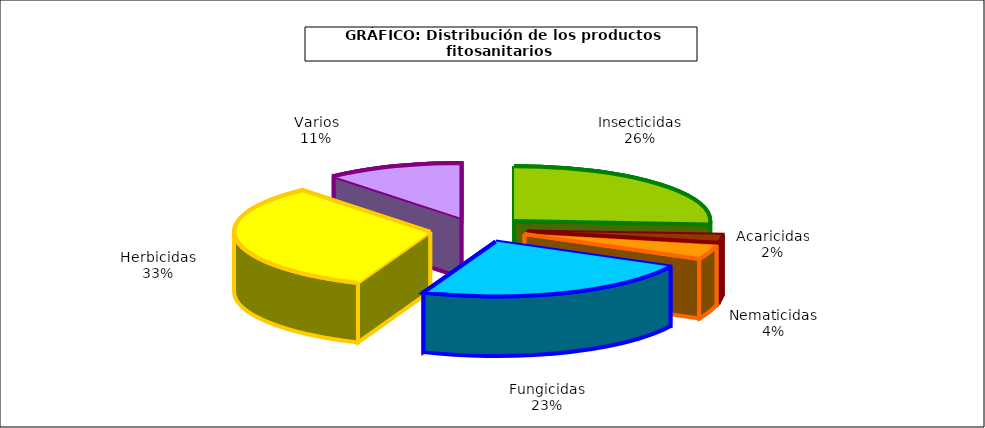
| Category | Insecticidas |
|---|---|
| Insecticidas | 316.736 |
| Acaricidas | 28.478 |
| Nematicidas | 51.233 |
| Fungicidas | 286.563 |
| Herbicidas | 398.945 |
| Varios | 137.619 |